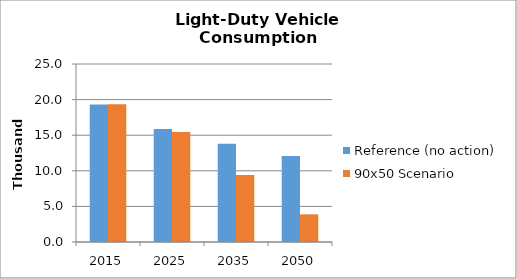
| Category | Reference (no action) | 90x50 Scenario |
|---|---|---|
| 2015.0 | 19.322 | 19.353 |
| 2025.0 | 15.882 | 15.451 |
| 2035.0 | 13.798 | 9.41 |
| 2050.0 | 12.074 | 3.886 |